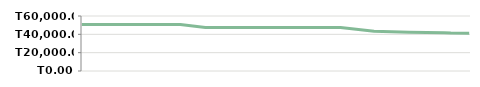
| Category | ТОҚСАН 3 |
|---|---|
| 2013-04-23 | 50800 |
| 2013-04-25 | 50800 |
| 2013-05-07 | 50800 |
| 2013-05-14 | 50800 |
| 2013-05-14 | 50800 |
| 2013-05-29 | 50800 |
| 2013-06-10 | 50800 |
| 2013-06-21 | 50800 |
| 2013-07-06 | 47400 |
| 2013-08-05 | 47400 |
| 2013-08-19 | 47400 |
| 2013-09-04 | 47400 |
| 2013-09-20 | 47400 |
| 2013-09-25 | 47400 |
| 2013-10-15 | 43258.14 |
| 2013-11-05 | 42312.903 |
| 2013-11-26 | 41811.111 |
| 2013-11-30 | 41500 |
| 2013-12-11 | 41288.235 |